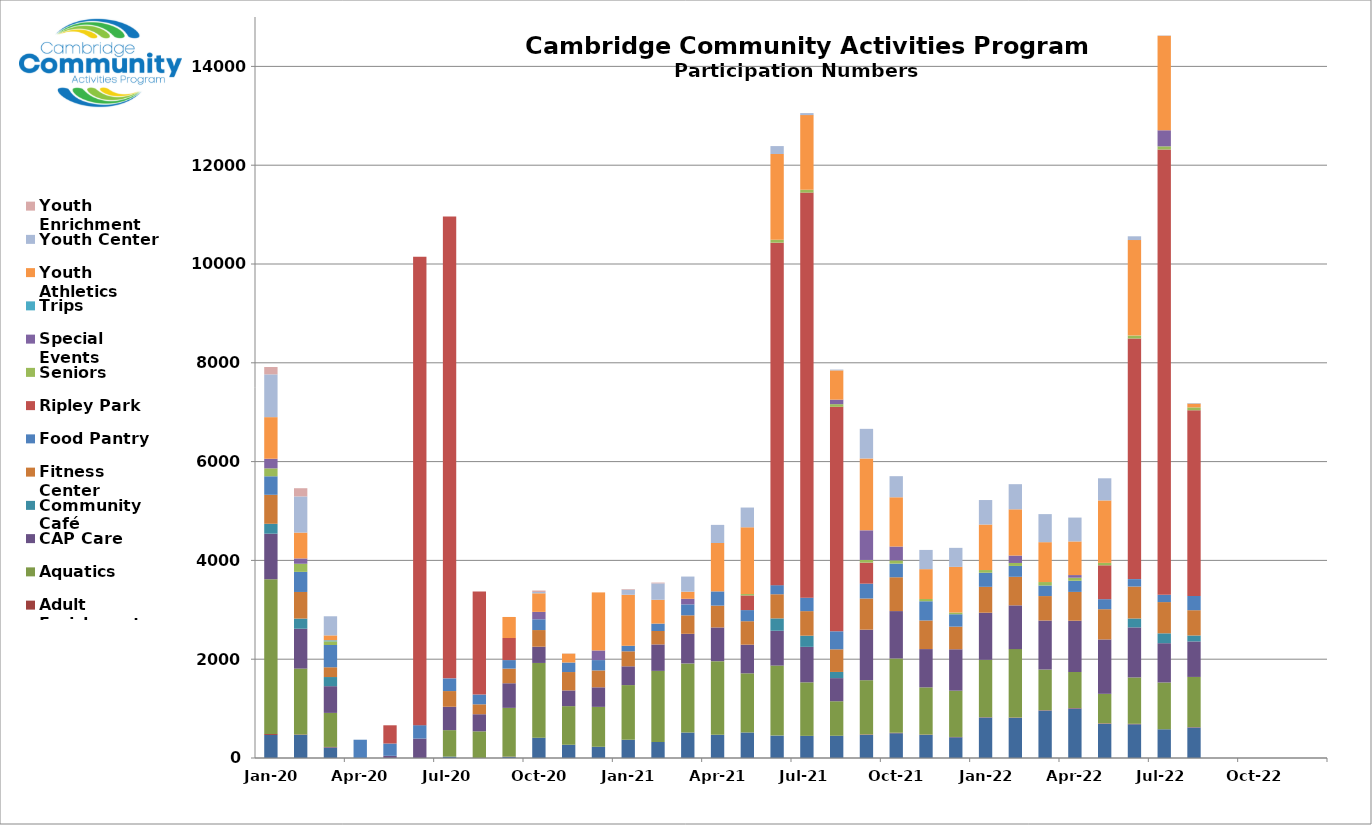
| Category | Adult Athletics | Adult Enrichment | Aquatics | CAP Care | Community Café | Fitness Center | Food Pantry | Ripley Park | Seniors | Special Events | Trips | Youth Athletics | Youth Center | Youth Enrichment |
|---|---|---|---|---|---|---|---|---|---|---|---|---|---|---|
| 2020-01-01 | 467 | 20 | 3132 | 922 | 200 | 587 | 375 | 0 | 160 | 195 | 0 | 842 | 866 | 149 |
| 2020-02-01 | 469 | 8 | 1333 | 807 | 205 | 539 | 407 | 0 | 164 | 108 | 0 | 523 | 732 | 166 |
| 2020-03-01 | 214 | 10 | 689 | 541 | 185 | 198 | 450 | 0 | 75 | 0 | 21 | 99 | 387 | 0 |
| 2020-04-01 | 0 | 0 | 0 | 0 | 0 | 0 | 370 | 0 | 0 | 0 | 0 | 0 | 0 | 0 |
| 2020-05-01 | 0 | 0 | 0 | 44 | 0 | 0 | 249 | 369 | 0 | 0 | 0 | 0 | 0 | 0 |
| 2020-06-01 | 0 | 0 | 0 | 394 | 0 | 0 | 271 | 9483 | 0 | 0 | 0 | 0 | 0 | 0 |
| 2020-07-01 | 28 | 0 | 536 | 473 | 0 | 318 | 257 | 9350 | 0 | 0 | 0 | 0 | 0 | 0 |
| 2020-08-01 | 0 | 0 | 540 | 346 | 0 | 201 | 198 | 2086 | 0 | 0 | 0 | 0 | 0 | 0 |
| 2020-09-01 | 22 | 6 | 987 | 498 | 0 | 297 | 172 | 447 | 0 | 0 | 0 | 426 | 0 | 0 |
| 2020-10-01 | 411 | 0 | 1513 | 329 | 0 | 337 | 218 | 0 | 0 | 150 | 0 | 376 | 26 | 30 |
| 2020-11-01 | 268 | 0 | 782 | 318 | 0 | 372 | 193 | 0 | 0 | 0 | 0 | 180 | 3 | 0 |
| 2020-12-01 | 227 | 0 | 808 | 396 | 0 | 342 | 209 | 0 | 0 | 195 | 0 | 1175 | 0 | 0 |
| 2021-01-01 | 370 | 0 | 1106 | 380 | 0 | 304 | 112 | 0 | 0 | 0 | 0 | 1032 | 102 | 13 |
| 2021-02-01 | 324 | 0 | 1440 | 535 | 0 | 272 | 150 | 0 | 0 | 0 | 0 | 482 | 332 | 16 |
| 2021-03-01 | 516 | 0 | 1398 | 600 | 0 | 374 | 222 | 0 | 0 | 113 | 0 | 144 | 306 | 0 |
| 2021-04-01 | 470 | 0 | 1490 | 683 | 0 | 442 | 288 | 0 | 0 | 0 | 0 | 979 | 367 | 0 |
| 2021-05-01 | 517 | 0 | 1197 | 580 | 0 | 475 | 225 | 297 | 28 | 0 | 0 | 1351 | 400 | 0 |
| 2021-06-01 | 454 | 0 | 1417 | 705 | 250 | 489 | 184 | 6932 | 60 | 0 | 0 | 1736 | 160 | 0 |
| 2021-07-01 | 448 | 0 | 1084 | 718 | 226 | 497 | 272 | 8200 | 58 | 0 | 0 | 1511 | 41 | 0 |
| 2021-08-01 | 450 | 0 | 699 | 468 | 125 | 458 | 365 | 4544 | 54 | 91 | 0 | 593 | 16 | 0 |
| 2021-09-01 | 469 | 9 | 1097 | 1023 | 0 | 631 | 300 | 426 | 54 | 600 | 0 | 1455 | 599 | 0 |
| 2021-10-01 | 502 | 8 | 1505 | 959 | 0 | 685 | 276 | 0 | 66 | 280 | 0 | 997 | 427 | 0 |
| 2021-11-01 | 468 | 6 | 956 | 775 | 0 | 579 | 389 | 0 | 46 | 0 | 0 | 604 | 389 | 0 |
| 2021-12-01 | 420 | 6 | 937 | 838 | 0 | 458 | 251 | 0 | 35 | 0 | 0 | 924 | 385 | 0 |
| 2022-01-01 | 820 | 6 | 1162 | 953 | 0 | 524 | 285 | 0 | 55 | 0 | 0 | 921 | 496 | 0 |
| 2022-02-01 | 813 | 7 | 1384 | 886 | 0 | 578 | 220 | 0 | 60 | 150 | 0 | 936 | 509 | 0 |
| 2022-03-01 | 961 | 7 | 823 | 992 | 0 | 495 | 214 | 0 | 70 | 0 | 0 | 807 | 568 | 0 |
| 2022-04-01 | 1003 | 9 | 729 | 1038 | 0 | 583 | 226 | 0 | 62 | 53 | 0 | 681 | 483 | 0 |
| 2022-05-01 | 693 | 9 | 597 | 1101 | 0 | 612 | 203 | 686 | 49 | 0 | 0 | 1264 | 448 | 0 |
| 2022-06-01 | 683 | 9 | 939 | 1013 | 180 | 647 | 150 | 4871 | 59 | 0 | 0 | 1934 | 76 | 0 |
| 2022-07-01 | 582 | 0 | 947 | 795 | 200 | 632 | 148 | 9014 | 64 | 325 | 0 | 1912 | 6 | 0 |
| 2022-08-01 | 618 | 7 | 1016 | 719 | 120 | 512 | 288 | 3759 | 58 | 0 | 0 | 78 | 11 | 0 |
| 2022-09-01 | 0 | 0 | 0 | 0 | 0 | 0 | 0 | 0 | 0 | 0 | 0 | 0 | 0 | 0 |
| 2022-10-01 | 0 | 0 | 0 | 0 | 0 | 0 | 0 | 0 | 0 | 0 | 0 | 0 | 0 | 0 |
| 2022-11-01 | 0 | 0 | 0 | 0 | 0 | 0 | 0 | 0 | 0 | 0 | 0 | 0 | 0 | 0 |
| 2022-12-01 | 0 | 0 | 0 | 0 | 0 | 0 | 0 | 0 | 0 | 0 | 0 | 0 | 0 | 0 |